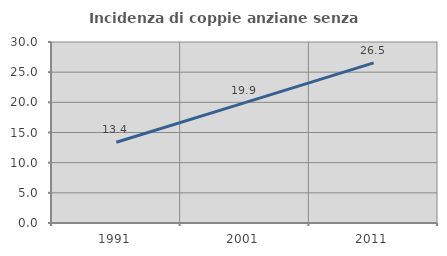
| Category | Incidenza di coppie anziane senza figli  |
|---|---|
| 1991.0 | 13.384 |
| 2001.0 | 19.945 |
| 2011.0 | 26.531 |